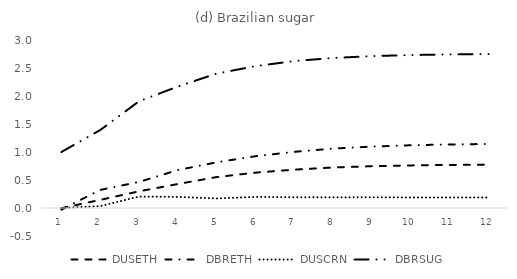
| Category | DUSETH | DBRETH | DUSCRN | DBRSUG |
|---|---|---|---|---|
| 0 | -0.003 | -0.03 | 0 | 1 |
| 1 | 0.145 | 0.323 | 0.034 | 1.393 |
| 2 | 0.298 | 0.466 | 0.204 | 1.907 |
| 3 | 0.429 | 0.678 | 0.198 | 2.169 |
| 4 | 0.553 | 0.816 | 0.17 | 2.401 |
| 5 | 0.631 | 0.925 | 0.199 | 2.533 |
| 6 | 0.685 | 1.003 | 0.192 | 2.624 |
| 7 | 0.724 | 1.062 | 0.191 | 2.679 |
| 8 | 0.747 | 1.096 | 0.191 | 2.712 |
| 9 | 0.761 | 1.12 | 0.188 | 2.731 |
| 10 | 0.769 | 1.135 | 0.188 | 2.742 |
| 11 | 0.774 | 1.144 | 0.188 | 2.748 |